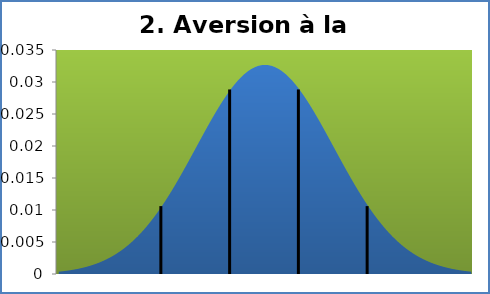
| Category | densité |
|---|---|
| 3.479999999999997 | 0 |
| 4.090499999999992 | 0 |
| 4.700999999999993 | 0 |
| 5.311499999999995 | 0.001 |
| 5.921999999999997 | 0.001 |
| 6.532499999999999 | 0.001 |
| 7.143000000000001 | 0.001 |
| 7.7535000000000025 | 0.001 |
| 8.363999999999997 | 0.001 |
| 8.974499999999999 | 0.001 |
| 9.585 | 0.001 |
| 10.195499999999996 | 0.002 |
| 10.805999999999997 | 0.002 |
| 11.4165 | 0.002 |
| 12.026999999999994 | 0.002 |
| 12.637499999999996 | 0.003 |
| 13.247999999999998 | 0.003 |
| 13.858499999999996 | 0.003 |
| 14.468999999999998 | 0.004 |
| 15.0795 | 0.004 |
| 15.689999999999998 | 0.004 |
| 16.300499999999996 | 0.005 |
| 16.910999999999998 | 0.005 |
| 17.521499999999996 | 0.006 |
| 18.131999999999998 | 0.006 |
| 18.7425 | 0.007 |
| 19.352999999999998 | 0.008 |
| 19.9635 | 0.008 |
| 20.573999999999998 | 0.009 |
| 21.184499999999996 | 0.01 |
| 21.794999999999998 | 0.011 |
| 22.405499999999996 | 0.011 |
| 23.016 | 0.012 |
| 23.6265 | 0.013 |
| 24.237 | 0.014 |
| 24.8475 | 0.015 |
| 25.458 | 0.016 |
| 26.068499999999997 | 0.017 |
| 26.679 | 0.018 |
| 27.289499999999997 | 0.019 |
| 27.9 | 0.02 |
| 28.5105 | 0.021 |
| 29.121 | 0.022 |
| 29.731499999999997 | 0.023 |
| 30.342 | 0.024 |
| 30.9525 | 0.025 |
| 31.563 | 0.026 |
| 32.1735 | 0.026 |
| 32.784 | 0.027 |
| 33.3945 | 0.028 |
| 34.004999999999995 | 0.029 |
| 34.6155 | 0.03 |
| 35.226 | 0.03 |
| 35.8365 | 0.031 |
| 36.447 | 0.031 |
| 37.0575 | 0.032 |
| 37.668 | 0.032 |
| 38.2785 | 0.032 |
| 38.888999999999996 | 0.033 |
| 39.4995 | 0.033 |
| 40.11 | 0.033 |
| 40.7205 | 0.033 |
| 41.331 | 0.033 |
| 41.9415 | 0.032 |
| 42.552 | 0.032 |
| 43.1625 | 0.032 |
| 43.772999999999996 | 0.031 |
| 44.3835 | 0.031 |
| 44.994 | 0.03 |
| 45.6045 | 0.03 |
| 46.215 | 0.029 |
| 46.8255 | 0.028 |
| 47.436 | 0.027 |
| 48.0465 | 0.026 |
| 48.657 | 0.026 |
| 49.2675 | 0.025 |
| 49.878 | 0.024 |
| 50.4885 | 0.023 |
| 51.099000000000004 | 0.022 |
| 51.7095 | 0.021 |
| 52.32 | 0.02 |
| 52.9305 | 0.019 |
| 53.541 | 0.018 |
| 54.1515 | 0.017 |
| 54.762 | 0.016 |
| 55.3725 | 0.015 |
| 55.983000000000004 | 0.014 |
| 56.5935 | 0.013 |
| 57.204 | 0.012 |
| 57.8145 | 0.011 |
| 58.425 | 0.011 |
| 59.0355 | 0.01 |
| 59.646 | 0.009 |
| 60.2565 | 0.008 |
| 60.867000000000004 | 0.008 |
| 61.4775 | 0.007 |
| 62.088 | 0.006 |
| 62.6985 | 0.006 |
| 63.309 | 0.005 |
| 63.9195 | 0.005 |
| 64.53 | 0.004 |
| 65.1405 | 0.004 |
| 65.751 | 0.004 |
| 66.3615 | 0.003 |
| 66.97200000000001 | 0.003 |
| 67.58250000000001 | 0.003 |
| 68.19300000000001 | 0.002 |
| 68.8035 | 0.002 |
| 69.414 | 0.002 |
| 70.0245 | 0.002 |
| 70.63499999999999 | 0.001 |
| 71.24549999999999 | 0.001 |
| 71.856 | 0.001 |
| 72.4665 | 0.001 |
| 73.077 | 0.001 |
| 73.6875 | 0.001 |
| 74.298 | 0.001 |
| 74.9085 | 0.001 |
| 75.519 | 0 |
| 76.12950000000001 | 0 |
| 76.74000000000001 | 0 |